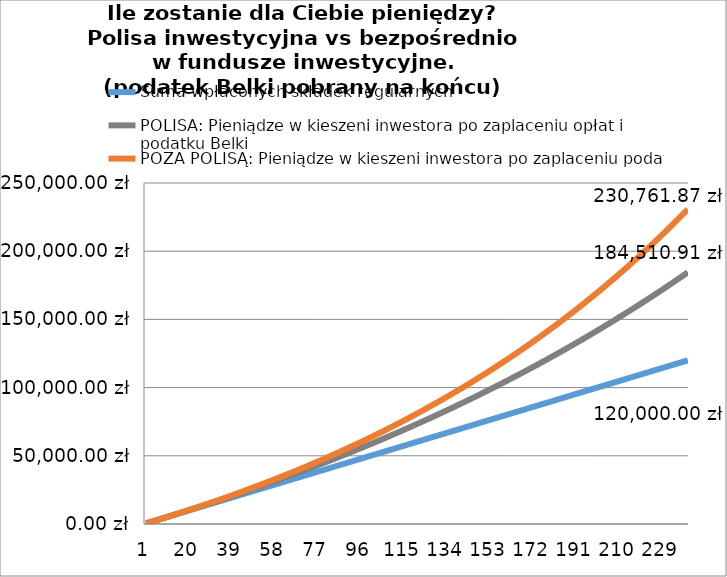
| Category | Suma wpłaconych składek regularnych | POLISA: Pieniądze w kieszeni inwestora po zaplaceniu opłat i podatku Belki | POZA POLISĄ: Pieniądze w kieszeni inwestora po zaplaceniu podatku Belki |
|---|---|---|---|
| 0 | 500 | 492.037 | 492.858 |
| 1 | 1000 | 986.077 | 988.592 |
| 2 | 1500 | 1482.13 | 1487.217 |
| 3 | 2000 | 1980.204 | 1988.751 |
| 4 | 2500 | 2480.306 | 2493.21 |
| 5 | 3000 | 2982.445 | 3000.496 |
| 6 | 3500 | 3486.629 | 3508.889 |
| 7 | 4000 | 3992.868 | 4019.693 |
| 8 | 4500 | 4500.946 | 4532.924 |
| 9 | 5000 | 5009.346 | 5048.593 |
| 10 | 5500 | 5519.43 | 5566.717 |
| 11 | 6000 | 6031.204 | 6087.309 |
| 12 | 6500 | 6544.676 | 6610.384 |
| 13 | 7000 | 7059.853 | 7135.955 |
| 14 | 7500 | 7576.741 | 7664.039 |
| 15 | 8000 | 8095.347 | 8194.648 |
| 16 | 8500 | 8615.679 | 8727.799 |
| 17 | 9000 | 9137.743 | 9263.505 |
| 18 | 9500 | 9661.547 | 9801.783 |
| 19 | 10000 | 10187.097 | 10342.646 |
| 20 | 10500 | 10714.401 | 10886.11 |
| 21 | 11000 | 11243.466 | 11432.19 |
| 22 | 11500 | 11774.299 | 11980.901 |
| 23 | 12000 | 12306.907 | 12532.259 |
| 24 | 12500 | 12841.297 | 13086.28 |
| 25 | 13000 | 13377.478 | 13642.977 |
| 26 | 13500 | 13915.455 | 14202.368 |
| 27 | 14000 | 14455.236 | 14764.468 |
| 28 | 14500 | 14996.829 | 15329.293 |
| 29 | 15000 | 15540.241 | 15896.858 |
| 30 | 15500 | 16085.48 | 16467.18 |
| 31 | 16000 | 16632.552 | 17040.275 |
| 32 | 16500 | 17181.466 | 17616.158 |
| 33 | 17000 | 17732.229 | 18194.847 |
| 34 | 17500 | 18284.848 | 18776.357 |
| 35 | 18000 | 18839.331 | 19360.705 |
| 36 | 18500 | 19395.685 | 19947.908 |
| 37 | 19000 | 19953.919 | 20537.982 |
| 38 | 19500 | 20514.039 | 21130.944 |
| 39 | 20000 | 21076.054 | 21726.81 |
| 40 | 20500 | 21639.971 | 22325.598 |
| 41 | 21000 | 22205.798 | 22927.325 |
| 42 | 21500 | 22773.543 | 23532.008 |
| 43 | 22000 | 23343.214 | 24139.665 |
| 44 | 22500 | 23914.818 | 24750.311 |
| 45 | 23000 | 24488.363 | 25363.966 |
| 46 | 23500 | 25063.857 | 25980.646 |
| 47 | 24000 | 25641.308 | 26600.369 |
| 48 | 24500 | 26220.725 | 27223.153 |
| 49 | 25000 | 26802.114 | 27849.016 |
| 50 | 25500 | 27385.485 | 28477.975 |
| 51 | 26000 | 27970.844 | 29110.05 |
| 52 | 26500 | 28558.202 | 29745.257 |
| 53 | 27000 | 29147.564 | 30383.615 |
| 54 | 27500 | 29738.94 | 31025.143 |
| 55 | 28000 | 30332.338 | 31669.859 |
| 56 | 28500 | 30927.766 | 32317.782 |
| 57 | 29000 | 31525.233 | 32968.93 |
| 58 | 29500 | 32124.745 | 33623.323 |
| 59 | 30000 | 32726.313 | 34280.978 |
| 60 | 30500 | 33329.945 | 34941.916 |
| 61 | 31000 | 33935.647 | 35606.155 |
| 62 | 31500 | 34543.43 | 36273.714 |
| 63 | 32000 | 35153.302 | 36944.614 |
| 64 | 32500 | 35765.271 | 37618.872 |
| 65 | 33000 | 36379.345 | 38296.51 |
| 66 | 33500 | 36995.534 | 38977.547 |
| 67 | 34000 | 37613.846 | 39662.002 |
| 68 | 34500 | 38234.289 | 40349.896 |
| 69 | 35000 | 38856.872 | 41041.248 |
| 70 | 35500 | 39481.604 | 41736.079 |
| 71 | 36000 | 40108.494 | 42434.408 |
| 72 | 36500 | 40737.551 | 43136.258 |
| 73 | 37000 | 41368.782 | 43841.647 |
| 74 | 37500 | 42002.198 | 44550.597 |
| 75 | 38000 | 42637.807 | 45263.128 |
| 76 | 38500 | 43275.618 | 45979.262 |
| 77 | 39000 | 43915.639 | 46699.018 |
| 78 | 39500 | 44557.881 | 47422.419 |
| 79 | 40000 | 45202.352 | 48149.486 |
| 80 | 40500 | 45849.06 | 48880.24 |
| 81 | 41000 | 46498.016 | 49614.703 |
| 82 | 41500 | 47149.228 | 50352.895 |
| 83 | 42000 | 47802.706 | 51094.84 |
| 84 | 42500 | 48458.459 | 51840.559 |
| 85 | 43000 | 49116.495 | 52590.073 |
| 86 | 43500 | 49776.825 | 53343.405 |
| 87 | 44000 | 50439.457 | 54100.578 |
| 88 | 44500 | 51104.402 | 54861.613 |
| 89 | 45000 | 51771.668 | 55626.534 |
| 90 | 45500 | 52441.265 | 56395.362 |
| 91 | 46000 | 53113.202 | 57168.121 |
| 92 | 46500 | 53787.489 | 57944.834 |
| 93 | 47000 | 54464.136 | 58725.523 |
| 94 | 47500 | 55143.152 | 59510.212 |
| 95 | 48000 | 55824.546 | 60298.924 |
| 96 | 48500 | 56508.329 | 61091.683 |
| 97 | 49000 | 57194.511 | 61888.513 |
| 98 | 49500 | 57883.1 | 62689.436 |
| 99 | 50000 | 58574.107 | 63494.477 |
| 100 | 50500 | 59267.542 | 64303.66 |
| 101 | 51000 | 59963.414 | 65117.009 |
| 102 | 51500 | 60661.733 | 65934.549 |
| 103 | 52000 | 61362.51 | 66756.303 |
| 104 | 52500 | 62065.754 | 67582.297 |
| 105 | 53000 | 62771.476 | 68412.554 |
| 106 | 53500 | 63479.685 | 69247.101 |
| 107 | 54000 | 64190.392 | 70085.962 |
| 108 | 54500 | 64903.607 | 70929.162 |
| 109 | 55000 | 65619.34 | 71776.727 |
| 110 | 55500 | 66337.601 | 72628.681 |
| 111 | 56000 | 67058.401 | 73485.051 |
| 112 | 56500 | 67781.75 | 74345.862 |
| 113 | 57000 | 68507.658 | 75211.141 |
| 114 | 57500 | 69236.136 | 76080.913 |
| 115 | 58000 | 69967.194 | 76955.204 |
| 116 | 58500 | 70700.843 | 77834.042 |
| 117 | 59000 | 71437.093 | 78717.451 |
| 118 | 59500 | 72175.956 | 79605.46 |
| 119 | 60000 | 72917.44 | 80498.095 |
| 120 | 60500 | 73661.558 | 81395.382 |
| 121 | 61000 | 74408.32 | 82297.35 |
| 122 | 61500 | 75157.736 | 83204.024 |
| 123 | 62000 | 75909.818 | 84115.434 |
| 124 | 62500 | 76664.577 | 85031.606 |
| 125 | 63000 | 77422.022 | 85952.568 |
| 126 | 63500 | 78182.166 | 86878.348 |
| 127 | 64000 | 78945.019 | 87808.975 |
| 128 | 64500 | 79710.593 | 88744.476 |
| 129 | 65000 | 80478.897 | 89684.88 |
| 130 | 65500 | 81249.944 | 90630.215 |
| 131 | 66000 | 82023.745 | 91580.511 |
| 132 | 66500 | 82800.311 | 92535.795 |
| 133 | 67000 | 83579.652 | 93496.099 |
| 134 | 67500 | 84361.782 | 94461.45 |
| 135 | 68000 | 85146.709 | 95431.877 |
| 136 | 68500 | 85934.447 | 96407.412 |
| 137 | 69000 | 86725.007 | 97388.083 |
| 138 | 69500 | 87518.4 | 98373.92 |
| 139 | 70000 | 88314.637 | 99364.954 |
| 140 | 70500 | 89113.731 | 100361.215 |
| 141 | 71000 | 89915.692 | 101362.733 |
| 142 | 71500 | 90720.533 | 102369.539 |
| 143 | 72000 | 91528.266 | 103381.664 |
| 144 | 72500 | 92338.901 | 104399.139 |
| 145 | 73000 | 93152.451 | 105421.996 |
| 146 | 73500 | 93968.928 | 106450.264 |
| 147 | 74000 | 94788.344 | 107483.977 |
| 148 | 74500 | 95610.71 | 108523.165 |
| 149 | 75000 | 96436.039 | 109567.861 |
| 150 | 75500 | 97264.343 | 110618.097 |
| 151 | 76000 | 98095.633 | 111673.906 |
| 152 | 76500 | 98929.922 | 112735.319 |
| 153 | 77000 | 99767.223 | 113802.369 |
| 154 | 77500 | 100607.547 | 114875.09 |
| 155 | 78000 | 101450.907 | 115953.514 |
| 156 | 78500 | 102297.315 | 117037.675 |
| 157 | 79000 | 103146.784 | 118127.606 |
| 158 | 79500 | 103999.326 | 119223.34 |
| 159 | 80000 | 104854.953 | 120324.913 |
| 160 | 80500 | 105713.679 | 121432.356 |
| 161 | 81000 | 106575.515 | 122545.706 |
| 162 | 81500 | 107440.474 | 123664.996 |
| 163 | 82000 | 108308.57 | 124790.262 |
| 164 | 82500 | 109179.815 | 125921.537 |
| 165 | 83000 | 110054.221 | 127058.857 |
| 166 | 83500 | 110931.802 | 128202.257 |
| 167 | 84000 | 111812.571 | 129351.773 |
| 168 | 84500 | 112696.54 | 130507.44 |
| 169 | 85000 | 113583.723 | 131669.295 |
| 170 | 85500 | 114474.132 | 132837.373 |
| 171 | 86000 | 115367.781 | 134011.71 |
| 172 | 86500 | 116264.683 | 135192.344 |
| 173 | 87000 | 117164.852 | 136379.31 |
| 174 | 87500 | 118068.3 | 137572.646 |
| 175 | 88000 | 118975.041 | 138772.389 |
| 176 | 88500 | 119885.088 | 139978.577 |
| 177 | 89000 | 120798.455 | 141191.246 |
| 178 | 89500 | 121715.155 | 142410.436 |
| 179 | 90000 | 122635.202 | 143636.183 |
| 180 | 90500 | 123558.61 | 144868.526 |
| 181 | 91000 | 124485.392 | 146107.503 |
| 182 | 91500 | 125415.562 | 147353.154 |
| 183 | 92000 | 126349.133 | 148605.516 |
| 184 | 92500 | 127286.12 | 149864.631 |
| 185 | 93000 | 128226.537 | 151130.535 |
| 186 | 93500 | 129170.397 | 152403.27 |
| 187 | 94000 | 130117.715 | 153682.876 |
| 188 | 94500 | 131068.504 | 154969.391 |
| 189 | 95000 | 132022.779 | 156262.857 |
| 190 | 95500 | 132980.554 | 157563.314 |
| 191 | 96000 | 133941.844 | 158870.802 |
| 192 | 96500 | 134906.661 | 160185.364 |
| 193 | 97000 | 135875.022 | 161507.04 |
| 194 | 97500 | 136846.94 | 162835.871 |
| 195 | 98000 | 137822.429 | 164171.9 |
| 196 | 98500 | 138801.505 | 165515.168 |
| 197 | 99000 | 139784.182 | 166865.717 |
| 198 | 99500 | 140770.475 | 168223.591 |
| 199 | 100000 | 141760.398 | 169588.831 |
| 200 | 100500 | 142753.966 | 170961.481 |
| 201 | 101000 | 143751.194 | 172341.584 |
| 202 | 101500 | 144752.097 | 173729.184 |
| 203 | 102000 | 145756.69 | 175124.324 |
| 204 | 102500 | 146764.987 | 176527.047 |
| 205 | 103000 | 147777.005 | 177937.4 |
| 206 | 103500 | 148792.758 | 179355.425 |
| 207 | 104000 | 149812.261 | 180781.167 |
| 208 | 104500 | 150835.53 | 182214.673 |
| 209 | 105000 | 151862.579 | 183655.986 |
| 210 | 105500 | 152893.425 | 185105.153 |
| 211 | 106000 | 153928.083 | 186562.219 |
| 212 | 106500 | 154966.568 | 188027.231 |
| 213 | 107000 | 156008.896 | 189500.234 |
| 214 | 107500 | 157055.083 | 190981.275 |
| 215 | 108000 | 158105.144 | 192470.402 |
| 216 | 108500 | 159159.095 | 193967.662 |
| 217 | 109000 | 160216.952 | 195473.101 |
| 218 | 109500 | 161278.731 | 196986.767 |
| 219 | 110000 | 162344.448 | 198508.71 |
| 220 | 110500 | 163414.118 | 200038.976 |
| 221 | 111000 | 164487.759 | 201577.614 |
| 222 | 111500 | 165565.386 | 203124.674 |
| 223 | 112000 | 166647.015 | 204680.204 |
| 224 | 112500 | 167732.662 | 206244.254 |
| 225 | 113000 | 168822.345 | 207816.873 |
| 226 | 113500 | 169916.079 | 209398.111 |
| 227 | 114000 | 171013.881 | 210988.02 |
| 228 | 114500 | 172115.768 | 212586.649 |
| 229 | 115000 | 173221.756 | 214194.048 |
| 230 | 115500 | 174331.861 | 215810.271 |
| 231 | 116000 | 175446.102 | 217435.367 |
| 232 | 116500 | 176564.493 | 219069.388 |
| 233 | 117000 | 177687.054 | 220712.387 |
| 234 | 117500 | 178813.799 | 222364.417 |
| 235 | 118000 | 179944.747 | 224025.528 |
| 236 | 118500 | 181079.915 | 225695.776 |
| 237 | 119000 | 182219.319 | 227375.212 |
| 238 | 119500 | 183362.978 | 229063.891 |
| 239 | 120000 | 184510.907 | 230761.867 |